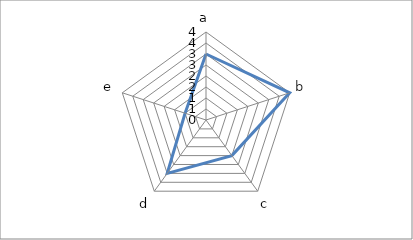
| Category | Series 0 |
|---|---|
| a | 3 |
| b | 4 |
| c | 2 |
| d | 3 |
| e | 1 |